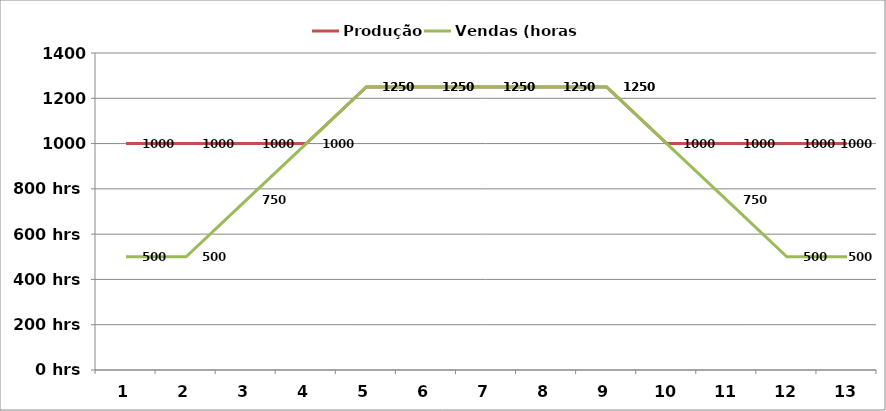
| Category | Produção | Vendas (horas) |
|---|---|---|
| 1.0 | 1000 | 500 |
| 2.0 | 1000 | 500 |
| 3.0 | 1000 | 750 |
| 4.0 | 1000 | 1000 |
| 5.0 | 1250 | 1250 |
| 6.0 | 1250 | 1250 |
| 7.0 | 1250 | 1250 |
| 8.0 | 1250 | 1250 |
| 9.0 | 1250 | 1250 |
| 10.0 | 1000 | 1000 |
| 11.0 | 1000 | 750 |
| 12.0 | 1000 | 500 |
| 13.0 | 1000 | 500 |